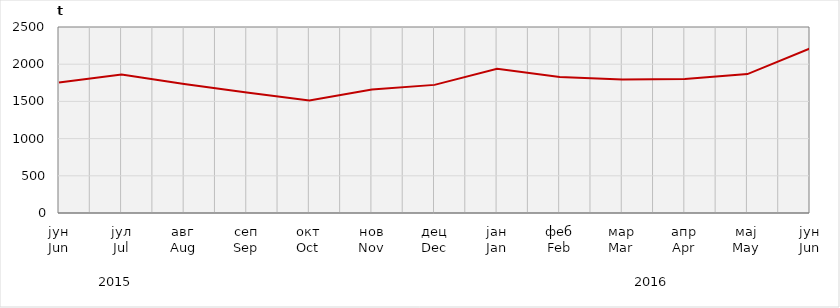
| Category | Нето тежина заклане стоке                              Net weight of  slaughtered livestock |
|---|---|
| јун
Jun | 1753845.16 |
| јул
Jul | 1862492.5 |
| авг
Aug | 1733294.8 |
| сеп
Sep | 1619599 |
| окт
Oct | 1511667.7 |
| нов
Nov | 1658700 |
| дец
Dec | 1721996.5 |
| јан
Jan | 1938649.7 |
| феб
Feb | 1828587.85 |
| мар
Mar | 1792740.7 |
| апр
Apr | 1800600 |
| мај
May | 1866665 |
| јун
Jun | 2210576.92 |